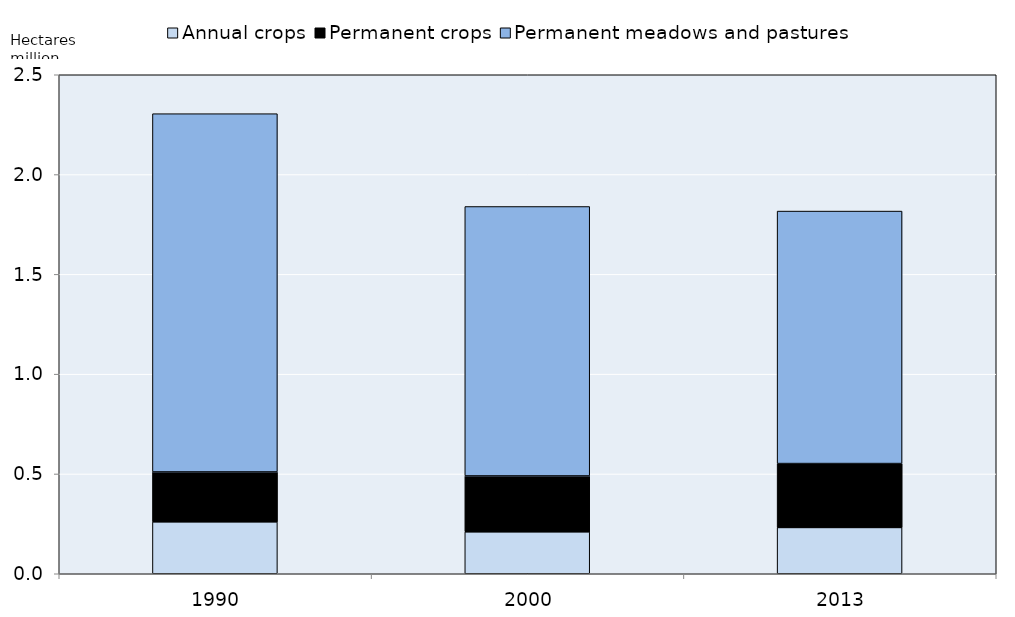
| Category | Annual crops | Permanent crops | Permanent meadows and pastures |
|---|---|---|---|
|  1990 | 0.26 | 0.25 | 1.795 |
|  2000 | 0.21 | 0.28 | 1.35 |
|  2013 | 0.232 | 0.32 | 1.265 |